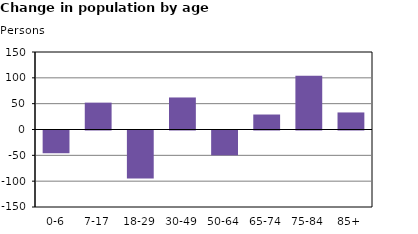
| Category | Series 2 |
|---|---|
| 0-6 | -44 |
| 7-17 | 52 |
| 18-29 | -93 |
| 30-49 | 62 |
| 50-64 | -48 |
| 65-74 | 29 |
| 75-84 | 104 |
| 85+ | 33 |